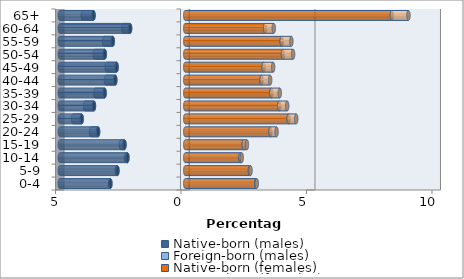
| Category | Native-born (males) | Foreign-born (males) | Native-born (females) | Foreign-born (females) |
|---|---|---|---|---|
| 0-4 | -2.983 | -0.016 | 2.83 | 0.015 |
| 5-9 | -2.702 | -0.03 | 2.574 | 0.027 |
| 10-14 | -2.304 | -0.059 | 2.197 | 0.054 |
| 15-19 | -2.422 | -0.142 | 2.33 | 0.126 |
| 20-24 | -3.473 | -0.277 | 3.396 | 0.241 |
| 25-29 | -4.127 | -0.342 | 4.119 | 0.302 |
| 30-34 | -3.638 | -0.354 | 3.742 | 0.32 |
| 35-39 | -3.214 | -0.369 | 3.429 | 0.336 |
| 40-44 | -2.787 | -0.371 | 3.04 | 0.343 |
| 45-49 | -2.736 | -0.395 | 3.124 | 0.377 |
| 50-54 | -3.207 | -0.398 | 3.893 | 0.405 |
| 55-59 | -2.889 | -0.348 | 3.844 | 0.384 |
| 60-64 | -2.198 | -0.266 | 3.181 | 0.345 |
| 65+ | -3.655 | -0.428 | 8.231 | 0.662 |